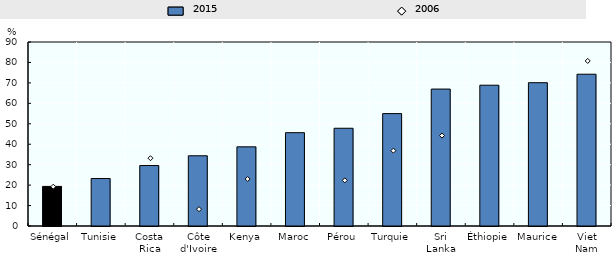
| Category | 2015 |
|---|---|
| Sénégal | 19.371 |
| Tunisie | 23.22 |
| Costa Rica | 29.571 |
| Côte d'Ivoire | 34.35 |
| Kenya | 38.719 |
| Maroc | 45.647 |
| Pérou | 47.812 |
| Turquie | 54.976 |
| Sri Lanka | 66.979 |
| Éthiopie | 68.863 |
| Maurice | 70.097 |
| Viet Nam | 74.241 |